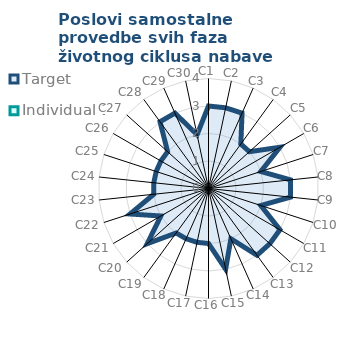
| Category | Target | Individual 1 |
|---|---|---|
| C1 | 3 | 0 |
| C2 | 3 | 0 |
| C3 | 3 | 0 |
| C4 | 2 | 0 |
| C5 | 2 | 0 |
| C6 | 3 | 0 |
| C7 | 2 | 0 |
| C8 | 3 | 0 |
| C9 | 3 | 0 |
| C10 | 2 | 0 |
| C11 | 3 | 0 |
| C12 | 3 | 0 |
| C13 | 3 | 0 |
| C14 | 2 | 0 |
| C15 | 3 | 0 |
| C16 | 2 | 0 |
| C17 | 2 | 0 |
| C18 | 2 | 0 |
| C19 | 2 | 0 |
| C20 | 3 | 0 |
| C21 | 2 | 0 |
| C22 | 3 | 0 |
| C23 | 2 | 0 |
| C24 | 2 | 0 |
| C25 | 2 | 0 |
| C26 | 2 | 0 |
| C27 | 2 | 0 |
| C28 | 3 | 0 |
| C29 | 3 | 0 |
| C30 | 2 | 0 |